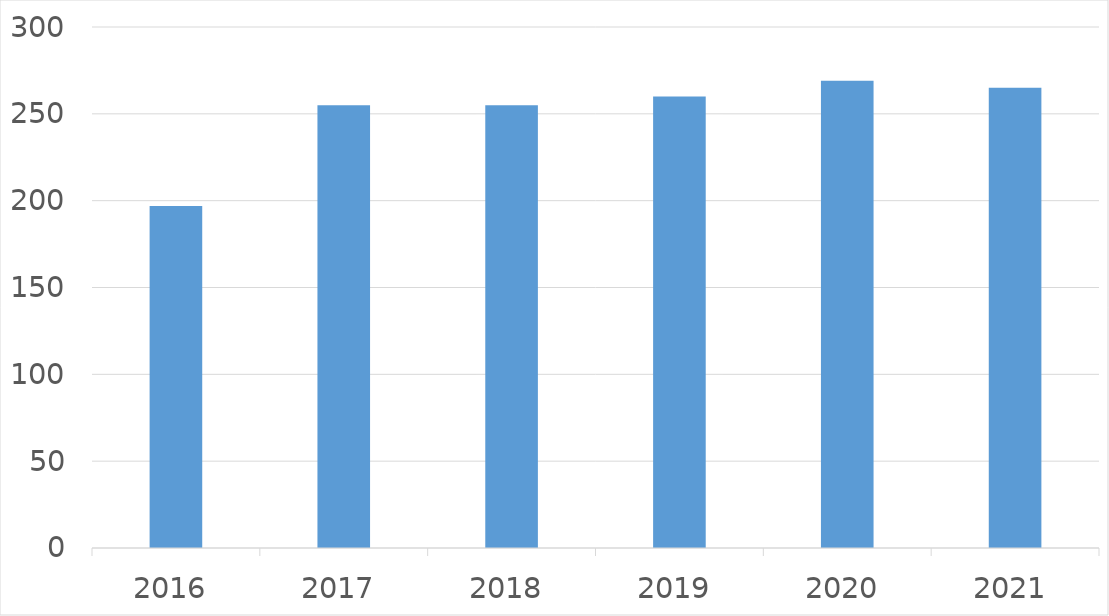
| Category | Series 0 |
|---|---|
| 2016 | 197 |
| 2017 | 255 |
| 2018 | 255 |
| 2019 | 260 |
| 2020 | 269 |
| 2021 | 265 |